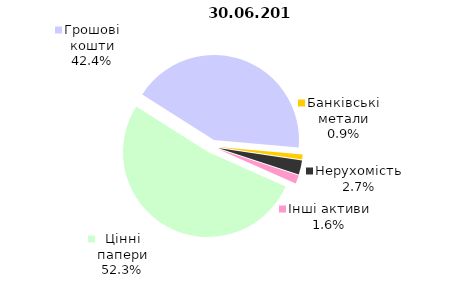
| Category | Всього |
|---|---|
| Цінні папери | 514221108.518 |
| Грошові кошти | 416474573.104 |
| Банківські метали | 9215678.43 |
| Нерухомість | 26616041.65 |
| Інші активи | 15781134.27 |